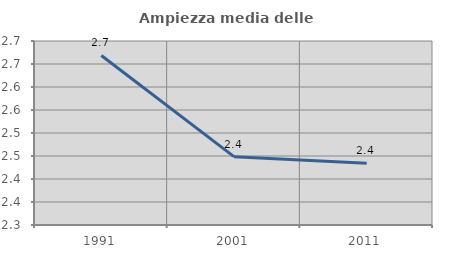
| Category | Ampiezza media delle famiglie |
|---|---|
| 1991.0 | 2.669 |
| 2001.0 | 2.449 |
| 2011.0 | 2.434 |